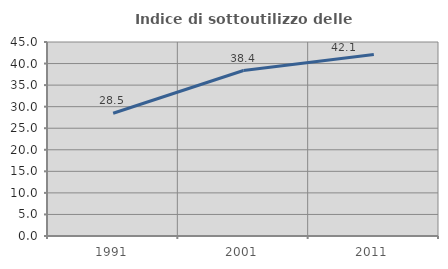
| Category | Indice di sottoutilizzo delle abitazioni  |
|---|---|
| 1991.0 | 28.467 |
| 2001.0 | 38.388 |
| 2011.0 | 42.088 |